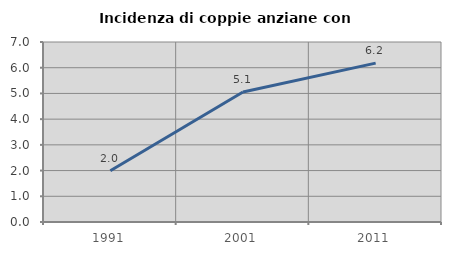
| Category | Incidenza di coppie anziane con figli |
|---|---|
| 1991.0 | 1.993 |
| 2001.0 | 5.058 |
| 2011.0 | 6.18 |